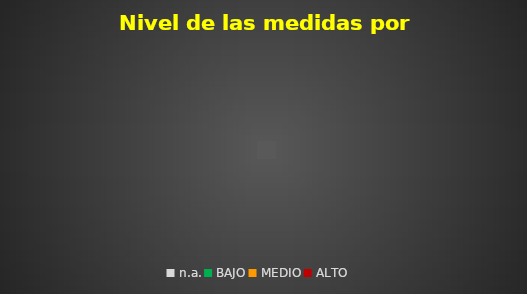
| Category | Número |
|---|---|
| n.a. | 0 |
| BAJO | 0 |
| MEDIO | 0 |
| ALTO | 0 |